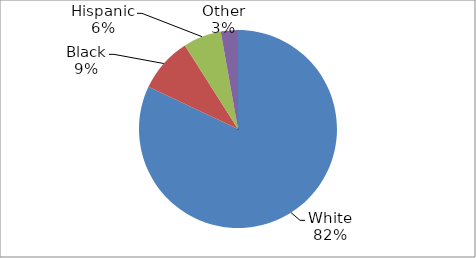
| Category | Series 0 |
|---|---|
| White | 0.82 |
| Black | 0.09 |
| Hispanic | 0.062 |
| Other | 0.028 |